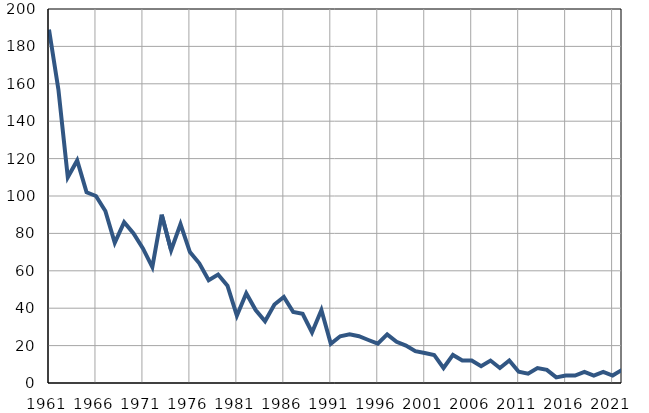
| Category | Умрла 
одојчад |
|---|---|
| 1961.0 | 189 |
| 1962.0 | 157 |
| 1963.0 | 110 |
| 1964.0 | 119 |
| 1965.0 | 102 |
| 1966.0 | 100 |
| 1967.0 | 92 |
| 1968.0 | 75 |
| 1969.0 | 86 |
| 1970.0 | 80 |
| 1971.0 | 72 |
| 1972.0 | 62 |
| 1973.0 | 90 |
| 1974.0 | 71 |
| 1975.0 | 85 |
| 1976.0 | 70 |
| 1977.0 | 64 |
| 1978.0 | 55 |
| 1979.0 | 58 |
| 1980.0 | 52 |
| 1981.0 | 36 |
| 1982.0 | 48 |
| 1983.0 | 39 |
| 1984.0 | 33 |
| 1985.0 | 42 |
| 1986.0 | 46 |
| 1987.0 | 38 |
| 1988.0 | 37 |
| 1989.0 | 27 |
| 1990.0 | 39 |
| 1991.0 | 21 |
| 1992.0 | 25 |
| 1993.0 | 26 |
| 1994.0 | 25 |
| 1995.0 | 23 |
| 1996.0 | 21 |
| 1997.0 | 26 |
| 1998.0 | 22 |
| 1999.0 | 20 |
| 2000.0 | 17 |
| 2001.0 | 16 |
| 2002.0 | 15 |
| 2003.0 | 8 |
| 2004.0 | 15 |
| 2005.0 | 12 |
| 2006.0 | 12 |
| 2007.0 | 9 |
| 2008.0 | 12 |
| 2009.0 | 8 |
| 2010.0 | 12 |
| 2011.0 | 6 |
| 2012.0 | 5 |
| 2013.0 | 8 |
| 2014.0 | 7 |
| 2015.0 | 3 |
| 2016.0 | 4 |
| 2017.0 | 4 |
| 2018.0 | 6 |
| 2019.0 | 4 |
| 2020.0 | 6 |
| 2021.0 | 4 |
| 2022.0 | 7 |